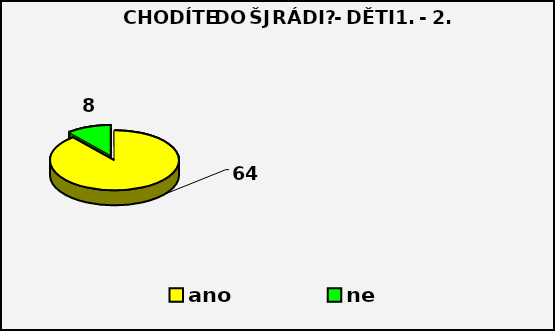
| Category | Series 0 |
|---|---|
| ano | 64 |
| ne | 8 |